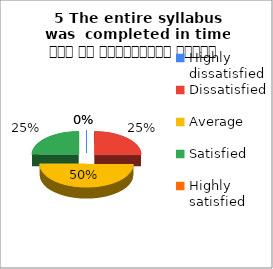
| Category | 5 The entire syllabus was  completed in time समय पर पाठ्यक्रम पूर्ण हुआ |
|---|---|
| Highly dissatisfied | 0 |
| Dissatisfied | 2 |
| Average | 4 |
| Satisfied | 2 |
| Highly satisfied | 0 |